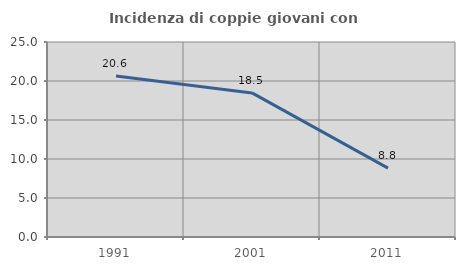
| Category | Incidenza di coppie giovani con figli |
|---|---|
| 1991.0 | 20.633 |
| 2001.0 | 18.47 |
| 2011.0 | 8.836 |